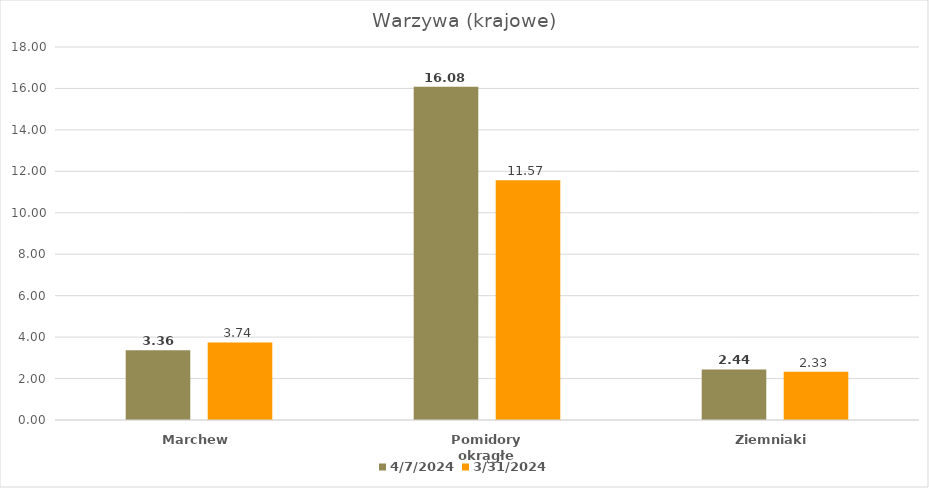
| Category | 2024-04-07 | 2024-03-31 |
|---|---|---|
| Marchew | 3.36 | 3.74 |
| Pomidory okrągłe | 16.08 | 11.57 |
| Ziemniaki | 2.44 | 2.33 |